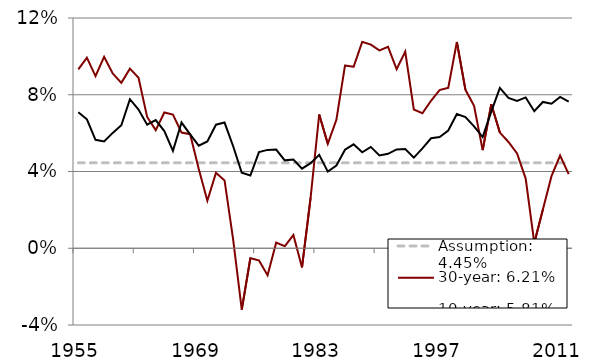
| Category | Assumption: 4.45% | 30-year: 6.21% | 10-year: 5.81% |
|---|---|---|---|
| 1955.0 | 0.044 | 0.093 | 0.071 |
| 1956.0 | 0.044 | 0.099 | 0.067 |
| 1957.0 | 0.044 | 0.09 | 0.057 |
| 1958.0 | 0.044 | 0.1 | 0.056 |
| 1959.0 | 0.044 | 0.091 | 0.06 |
| 1960.0 | 0.044 | 0.086 | 0.064 |
| 1961.0 | 0.044 | 0.094 | 0.078 |
| 1962.0 | 0.044 | 0.089 | 0.072 |
| 1963.0 | 0.044 | 0.068 | 0.064 |
| 1964.0 | 0.044 | 0.062 | 0.067 |
| 1965.0 | 0.044 | 0.071 | 0.061 |
| 1966.0 | 0.044 | 0.07 | 0.051 |
| 1967.0 | 0.044 | 0.06 | 0.066 |
| 1968.0 | 0.044 | 0.059 | 0.059 |
| 1969.0 | 0.044 | 0.041 | 0.053 |
| 1970.0 | 0.044 | 0.025 | 0.056 |
| 1971.0 | 0.044 | 0.039 | 0.064 |
| 1972.0 | 0.044 | 0.035 | 0.066 |
| 1973.0 | 0.044 | 0.005 | 0.053 |
| 1974.0 | 0.044 | -0.032 | 0.039 |
| 1975.0 | 0.044 | -0.005 | 0.038 |
| 1976.0 | 0.044 | -0.006 | 0.05 |
| 1977.0 | 0.044 | -0.014 | 0.051 |
| 1978.0 | 0.044 | 0.003 | 0.051 |
| 1979.0 | 0.044 | 0.001 | 0.046 |
| 1980.0 | 0.044 | 0.007 | 0.046 |
| 1981.0 | 0.044 | -0.01 | 0.041 |
| 1982.0 | 0.044 | 0.026 | 0.044 |
| 1983.0 | 0.044 | 0.07 | 0.049 |
| 1984.0 | 0.044 | 0.054 | 0.04 |
| 1985.0 | 0.044 | 0.067 | 0.043 |
| 1986.0 | 0.044 | 0.095 | 0.051 |
| 1987.0 | 0.044 | 0.095 | 0.054 |
| 1988.0 | 0.044 | 0.108 | 0.05 |
| 1989.0 | 0.044 | 0.106 | 0.053 |
| 1990.0 | 0.044 | 0.103 | 0.048 |
| 1991.0 | 0.044 | 0.105 | 0.049 |
| 1992.0 | 0.044 | 0.093 | 0.052 |
| 1993.0 | 0.044 | 0.102 | 0.052 |
| 1994.0 | 0.044 | 0.072 | 0.047 |
| 1995.0 | 0.044 | 0.07 | 0.052 |
| 1996.0 | 0.044 | 0.077 | 0.057 |
| 1997.0 | 0.044 | 0.082 | 0.058 |
| 1998.0 | 0.044 | 0.084 | 0.061 |
| 1999.0 | 0.044 | 0.108 | 0.07 |
| 2000.0 | 0.044 | 0.083 | 0.068 |
| 2001.0 | 0.044 | 0.074 | 0.064 |
| 2002.0 | 0.044 | 0.051 | 0.058 |
| 2003.0 | 0.044 | 0.075 | 0.071 |
| 2004.0 | 0.044 | 0.06 | 0.084 |
| 2005.0 | 0.044 | 0.055 | 0.078 |
| 2006.0 | 0.044 | 0.049 | 0.077 |
| 2007.0 | 0.044 | 0.036 | 0.079 |
| 2008.0 | 0.044 | 0.003 | 0.071 |
| 2009.0 | 0.044 | 0.02 | 0.076 |
| 2010.0 | 0.044 | 0.038 | 0.075 |
| 2011.0 | 0.044 | 0.048 | 0.079 |
| 2012.0 | 0.044 | 0.039 | 0.076 |